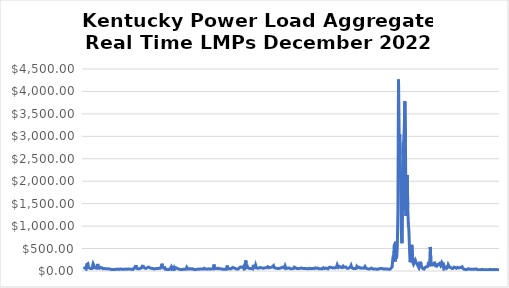
| Category | total_lmp_rt |
|---|---|
| 2022-12-01 05:00:00 | 72.968 |
| 2022-12-01 06:00:00 | 71.115 |
| 2022-12-01 07:00:00 | 66.847 |
| 2022-12-01 08:00:00 | 55.534 |
| 2022-12-01 09:00:00 | 77.757 |
| 2022-12-01 10:00:00 | 53.501 |
| 2022-12-01 11:00:00 | 144.763 |
| 2022-12-01 12:00:00 | 129.385 |
| 2022-12-01 13:00:00 | 161.992 |
| 2022-12-01 14:00:00 | 76.306 |
| 2022-12-01 15:00:00 | 62.544 |
| 2022-12-01 16:00:00 | 62.242 |
| 2022-12-01 17:00:00 | 60.23 |
| 2022-12-01 18:00:00 | 53.278 |
| 2022-12-01 19:00:00 | 52.015 |
| 2022-12-01 20:00:00 | 53.457 |
| 2022-12-01 21:00:00 | 67.545 |
| 2022-12-01 22:00:00 | 161.255 |
| 2022-12-01 23:00:00 | 132.922 |
| 2022-12-02 | 75.383 |
| 2022-12-02 01:00:00 | 80.03 |
| 2022-12-02 02:00:00 | 69.334 |
| 2022-12-02 03:00:00 | 62.77 |
| 2022-12-02 04:00:00 | 62.117 |
| 2022-12-02 05:00:00 | 80.503 |
| 2022-12-02 06:00:00 | 156.75 |
| 2022-12-02 07:00:00 | 77.523 |
| 2022-12-02 08:00:00 | 64.673 |
| 2022-12-02 09:00:00 | 58.983 |
| 2022-12-02 10:00:00 | 53.458 |
| 2022-12-02 11:00:00 | 78.955 |
| 2022-12-02 12:00:00 | 83.455 |
| 2022-12-02 13:00:00 | 72.29 |
| 2022-12-02 14:00:00 | 57.19 |
| 2022-12-02 15:00:00 | 50.995 |
| 2022-12-02 16:00:00 | 50.774 |
| 2022-12-02 17:00:00 | 54.528 |
| 2022-12-02 18:00:00 | 50.775 |
| 2022-12-02 19:00:00 | 52.014 |
| 2022-12-02 20:00:00 | 48.647 |
| 2022-12-02 21:00:00 | 51.531 |
| 2022-12-02 22:00:00 | 51.166 |
| 2022-12-02 23:00:00 | 50.798 |
| 2022-12-03 | 44.968 |
| 2022-12-03 01:00:00 | 46.812 |
| 2022-12-03 02:00:00 | 49.98 |
| 2022-12-03 03:00:00 | 44.397 |
| 2022-12-03 04:00:00 | 40.021 |
| 2022-12-03 05:00:00 | 35.432 |
| 2022-12-03 06:00:00 | 34.47 |
| 2022-12-03 07:00:00 | 33.284 |
| 2022-12-03 08:00:00 | 32.14 |
| 2022-12-03 09:00:00 | 33.902 |
| 2022-12-03 10:00:00 | 34.289 |
| 2022-12-03 11:00:00 | 34.054 |
| 2022-12-03 12:00:00 | 36.284 |
| 2022-12-03 13:00:00 | 38.821 |
| 2022-12-03 14:00:00 | 50.355 |
| 2022-12-03 15:00:00 | 38.915 |
| 2022-12-03 16:00:00 | 37.517 |
| 2022-12-03 17:00:00 | 42.807 |
| 2022-12-03 18:00:00 | 37.312 |
| 2022-12-03 19:00:00 | 35.168 |
| 2022-12-03 20:00:00 | 37.104 |
| 2022-12-03 21:00:00 | 44.084 |
| 2022-12-03 22:00:00 | 50.157 |
| 2022-12-03 23:00:00 | 41.532 |
| 2022-12-04 | 37.338 |
| 2022-12-04 01:00:00 | 39.371 |
| 2022-12-04 02:00:00 | 39.074 |
| 2022-12-04 03:00:00 | 41.411 |
| 2022-12-04 04:00:00 | 37.251 |
| 2022-12-04 05:00:00 | 39.615 |
| 2022-12-04 06:00:00 | 40.901 |
| 2022-12-04 07:00:00 | 44.484 |
| 2022-12-04 08:00:00 | 49.06 |
| 2022-12-04 09:00:00 | 38.561 |
| 2022-12-04 10:00:00 | 44.48 |
| 2022-12-04 11:00:00 | 44.413 |
| 2022-12-04 12:00:00 | 46.541 |
| 2022-12-04 13:00:00 | 41.88 |
| 2022-12-04 14:00:00 | 39.599 |
| 2022-12-04 15:00:00 | 40.661 |
| 2022-12-04 16:00:00 | 39.61 |
| 2022-12-04 17:00:00 | 37.993 |
| 2022-12-04 18:00:00 | 35.511 |
| 2022-12-04 19:00:00 | 35.707 |
| 2022-12-04 20:00:00 | 36.865 |
| 2022-12-04 21:00:00 | 66.652 |
| 2022-12-04 22:00:00 | 83.476 |
| 2022-12-04 23:00:00 | 87.166 |
| 2022-12-05 | 130.054 |
| 2022-12-05 01:00:00 | 60.303 |
| 2022-12-05 02:00:00 | 54.114 |
| 2022-12-05 03:00:00 | 52.074 |
| 2022-12-05 04:00:00 | 45.267 |
| 2022-12-05 05:00:00 | 47.244 |
| 2022-12-05 06:00:00 | 51.552 |
| 2022-12-05 07:00:00 | 55.775 |
| 2022-12-05 08:00:00 | 56.871 |
| 2022-12-05 09:00:00 | 63.464 |
| 2022-12-05 10:00:00 | 79.667 |
| 2022-12-05 11:00:00 | 108.524 |
| 2022-12-05 12:00:00 | 114.294 |
| 2022-12-05 13:00:00 | 102.926 |
| 2022-12-05 14:00:00 | 73.124 |
| 2022-12-05 15:00:00 | 68.339 |
| 2022-12-05 16:00:00 | 62.836 |
| 2022-12-05 17:00:00 | 63.811 |
| 2022-12-05 18:00:00 | 59.455 |
| 2022-12-05 19:00:00 | 59.887 |
| 2022-12-05 20:00:00 | 78.845 |
| 2022-12-05 21:00:00 | 66.143 |
| 2022-12-05 22:00:00 | 86.52 |
| 2022-12-05 23:00:00 | 74.453 |
| 2022-12-06 | 71.548 |
| 2022-12-06 01:00:00 | 71.678 |
| 2022-12-06 02:00:00 | 62.349 |
| 2022-12-06 03:00:00 | 55.345 |
| 2022-12-06 04:00:00 | 53.792 |
| 2022-12-06 05:00:00 | 57.349 |
| 2022-12-06 06:00:00 | 53.973 |
| 2022-12-06 07:00:00 | 48.415 |
| 2022-12-06 08:00:00 | 43.917 |
| 2022-12-06 09:00:00 | 48.074 |
| 2022-12-06 10:00:00 | 52.559 |
| 2022-12-06 11:00:00 | 47.477 |
| 2022-12-06 12:00:00 | 54.911 |
| 2022-12-06 13:00:00 | 51.92 |
| 2022-12-06 14:00:00 | 56.962 |
| 2022-12-06 15:00:00 | 52.118 |
| 2022-12-06 16:00:00 | 59.213 |
| 2022-12-06 17:00:00 | 57.22 |
| 2022-12-06 18:00:00 | 59.532 |
| 2022-12-06 19:00:00 | 47.712 |
| 2022-12-06 20:00:00 | 100.912 |
| 2022-12-06 21:00:00 | 162.377 |
| 2022-12-06 22:00:00 | 94.604 |
| 2022-12-06 23:00:00 | 78.298 |
| 2022-12-07 | 65.498 |
| 2022-12-07 01:00:00 | 58.237 |
| 2022-12-07 02:00:00 | 75.032 |
| 2022-12-07 03:00:00 | 39.588 |
| 2022-12-07 04:00:00 | 31.875 |
| 2022-12-07 05:00:00 | 36.134 |
| 2022-12-07 06:00:00 | 35.708 |
| 2022-12-07 07:00:00 | 32.119 |
| 2022-12-07 08:00:00 | 31.491 |
| 2022-12-07 09:00:00 | 32.957 |
| 2022-12-07 10:00:00 | 39.308 |
| 2022-12-07 11:00:00 | 47.636 |
| 2022-12-07 12:00:00 | 55.557 |
| 2022-12-07 13:00:00 | 90.271 |
| 2022-12-07 14:00:00 | 47.759 |
| 2022-12-07 15:00:00 | 73.52 |
| 2022-12-07 16:00:00 | 57.577 |
| 2022-12-07 17:00:00 | 41.275 |
| 2022-12-07 18:00:00 | 72.631 |
| 2022-12-07 19:00:00 | 41.496 |
| 2022-12-07 20:00:00 | 44.571 |
| 2022-12-07 21:00:00 | 73.17 |
| 2022-12-07 22:00:00 | 90.959 |
| 2022-12-07 23:00:00 | 59.127 |
| 2022-12-08 | 49.324 |
| 2022-12-08 01:00:00 | 49.591 |
| 2022-12-08 02:00:00 | 58.83 |
| 2022-12-08 03:00:00 | 37.605 |
| 2022-12-08 04:00:00 | 31.746 |
| 2022-12-08 05:00:00 | 34.089 |
| 2022-12-08 06:00:00 | 32.861 |
| 2022-12-08 07:00:00 | 30.393 |
| 2022-12-08 08:00:00 | 30.276 |
| 2022-12-08 09:00:00 | 36.063 |
| 2022-12-08 10:00:00 | 55.006 |
| 2022-12-08 11:00:00 | 42.049 |
| 2022-12-08 12:00:00 | 59.973 |
| 2022-12-08 13:00:00 | 36.8 |
| 2022-12-08 14:00:00 | 52.381 |
| 2022-12-08 15:00:00 | 40.66 |
| 2022-12-08 16:00:00 | 82.755 |
| 2022-12-08 17:00:00 | 64.437 |
| 2022-12-08 18:00:00 | 50.74 |
| 2022-12-08 19:00:00 | 52.31 |
| 2022-12-08 20:00:00 | 42.831 |
| 2022-12-08 21:00:00 | 58.557 |
| 2022-12-08 22:00:00 | 53.903 |
| 2022-12-08 23:00:00 | 42.645 |
| 2022-12-09 | 44.646 |
| 2022-12-09 01:00:00 | 44.723 |
| 2022-12-09 02:00:00 | 49.321 |
| 2022-12-09 03:00:00 | 37.536 |
| 2022-12-09 04:00:00 | 34.927 |
| 2022-12-09 05:00:00 | 32.16 |
| 2022-12-09 06:00:00 | 33.27 |
| 2022-12-09 07:00:00 | 33.328 |
| 2022-12-09 08:00:00 | 34.375 |
| 2022-12-09 09:00:00 | 37.818 |
| 2022-12-09 10:00:00 | 36.639 |
| 2022-12-09 11:00:00 | 55.028 |
| 2022-12-09 12:00:00 | 46.267 |
| 2022-12-09 13:00:00 | 37.213 |
| 2022-12-09 14:00:00 | 40.32 |
| 2022-12-09 15:00:00 | 42.922 |
| 2022-12-09 16:00:00 | 43.792 |
| 2022-12-09 17:00:00 | 45.854 |
| 2022-12-09 18:00:00 | 45.982 |
| 2022-12-09 19:00:00 | 47.952 |
| 2022-12-09 20:00:00 | 41.847 |
| 2022-12-09 21:00:00 | 50.755 |
| 2022-12-09 22:00:00 | 60.679 |
| 2022-12-09 23:00:00 | 47.279 |
| 2022-12-10 | 45.025 |
| 2022-12-10 01:00:00 | 45.543 |
| 2022-12-10 02:00:00 | 45.951 |
| 2022-12-10 03:00:00 | 43.673 |
| 2022-12-10 04:00:00 | 40.79 |
| 2022-12-10 05:00:00 | 48.121 |
| 2022-12-10 06:00:00 | 49.057 |
| 2022-12-10 07:00:00 | 46.953 |
| 2022-12-10 08:00:00 | 43.664 |
| 2022-12-10 09:00:00 | 49.439 |
| 2022-12-10 10:00:00 | 44.179 |
| 2022-12-10 11:00:00 | 43.996 |
| 2022-12-10 12:00:00 | 48.755 |
| 2022-12-10 13:00:00 | 50.001 |
| 2022-12-10 14:00:00 | 63.6 |
| 2022-12-10 15:00:00 | 144.541 |
| 2022-12-10 16:00:00 | 50.954 |
| 2022-12-10 17:00:00 | 56.826 |
| 2022-12-10 18:00:00 | 59.881 |
| 2022-12-10 19:00:00 | 54.579 |
| 2022-12-10 20:00:00 | 52.352 |
| 2022-12-10 21:00:00 | 49.735 |
| 2022-12-10 22:00:00 | 62.311 |
| 2022-12-10 23:00:00 | 51.551 |
| 2022-12-11 | 48.047 |
| 2022-12-11 01:00:00 | 47.417 |
| 2022-12-11 02:00:00 | 51.161 |
| 2022-12-11 03:00:00 | 45.91 |
| 2022-12-11 04:00:00 | 42.925 |
| 2022-12-11 05:00:00 | 40.588 |
| 2022-12-11 06:00:00 | 41.398 |
| 2022-12-11 07:00:00 | 41.706 |
| 2022-12-11 08:00:00 | 41.117 |
| 2022-12-11 09:00:00 | 39.103 |
| 2022-12-11 10:00:00 | 38.779 |
| 2022-12-11 11:00:00 | 37.521 |
| 2022-12-11 12:00:00 | 37.752 |
| 2022-12-11 13:00:00 | 44.182 |
| 2022-12-11 14:00:00 | 121.578 |
| 2022-12-11 15:00:00 | 49.496 |
| 2022-12-11 16:00:00 | 51.548 |
| 2022-12-11 17:00:00 | 48.05 |
| 2022-12-11 18:00:00 | 48.759 |
| 2022-12-11 19:00:00 | 48.409 |
| 2022-12-11 20:00:00 | 52.229 |
| 2022-12-11 21:00:00 | 51.83 |
| 2022-12-11 22:00:00 | 69.457 |
| 2022-12-11 23:00:00 | 78.924 |
| 2022-12-12 | 75.476 |
| 2022-12-12 01:00:00 | 70.08 |
| 2022-12-12 02:00:00 | 63.348 |
| 2022-12-12 03:00:00 | 63.431 |
| 2022-12-12 04:00:00 | 49.876 |
| 2022-12-12 05:00:00 | 47.073 |
| 2022-12-12 06:00:00 | 53.329 |
| 2022-12-12 07:00:00 | 46.144 |
| 2022-12-12 08:00:00 | 51.742 |
| 2022-12-12 09:00:00 | 43.843 |
| 2022-12-12 10:00:00 | 42.388 |
| 2022-12-12 11:00:00 | 71.727 |
| 2022-12-12 12:00:00 | 75.454 |
| 2022-12-12 13:00:00 | 90.278 |
| 2022-12-12 14:00:00 | 69.73 |
| 2022-12-12 15:00:00 | 85.471 |
| 2022-12-12 16:00:00 | 91.666 |
| 2022-12-12 17:00:00 | 68.919 |
| 2022-12-12 18:00:00 | 93.761 |
| 2022-12-12 19:00:00 | 60.262 |
| 2022-12-12 20:00:00 | 70.312 |
| 2022-12-12 21:00:00 | 113.593 |
| 2022-12-12 22:00:00 | 235.297 |
| 2022-12-12 23:00:00 | 77.65 |
| 2022-12-13 | 76.804 |
| 2022-12-13 01:00:00 | 97.544 |
| 2022-12-13 02:00:00 | 70.09 |
| 2022-12-13 03:00:00 | 61.727 |
| 2022-12-13 04:00:00 | 57.633 |
| 2022-12-13 05:00:00 | 64.35 |
| 2022-12-13 06:00:00 | 57.744 |
| 2022-12-13 07:00:00 | 56.149 |
| 2022-12-13 08:00:00 | 56.584 |
| 2022-12-13 09:00:00 | 66.112 |
| 2022-12-13 10:00:00 | 46.731 |
| 2022-12-13 11:00:00 | 137.069 |
| 2022-12-13 12:00:00 | 92.694 |
| 2022-12-13 13:00:00 | 82.823 |
| 2022-12-13 14:00:00 | 79.651 |
| 2022-12-13 15:00:00 | 129.777 |
| 2022-12-13 16:00:00 | 86.482 |
| 2022-12-13 17:00:00 | 70.063 |
| 2022-12-13 18:00:00 | 61.56 |
| 2022-12-13 19:00:00 | 60.582 |
| 2022-12-13 20:00:00 | 63.72 |
| 2022-12-13 21:00:00 | 71.802 |
| 2022-12-13 22:00:00 | 76.757 |
| 2022-12-13 23:00:00 | 64.004 |
| 2022-12-14 | 73.832 |
| 2022-12-14 01:00:00 | 82.886 |
| 2022-12-14 02:00:00 | 67.731 |
| 2022-12-14 03:00:00 | 72.867 |
| 2022-12-14 04:00:00 | 62.858 |
| 2022-12-14 05:00:00 | 70.461 |
| 2022-12-14 06:00:00 | 66.448 |
| 2022-12-14 07:00:00 | 67.181 |
| 2022-12-14 08:00:00 | 72.316 |
| 2022-12-14 09:00:00 | 86.778 |
| 2022-12-14 10:00:00 | 71.28 |
| 2022-12-14 11:00:00 | 85.738 |
| 2022-12-14 12:00:00 | 95.735 |
| 2022-12-14 13:00:00 | 92.798 |
| 2022-12-14 14:00:00 | 70.958 |
| 2022-12-14 15:00:00 | 83.586 |
| 2022-12-14 16:00:00 | 80.132 |
| 2022-12-14 17:00:00 | 70.732 |
| 2022-12-14 18:00:00 | 82.057 |
| 2022-12-14 19:00:00 | 75.014 |
| 2022-12-14 20:00:00 | 91.328 |
| 2022-12-14 21:00:00 | 101.219 |
| 2022-12-14 22:00:00 | 117.3 |
| 2022-12-14 23:00:00 | 77.077 |
| 2022-12-15 | 68.703 |
| 2022-12-15 01:00:00 | 65.832 |
| 2022-12-15 02:00:00 | 68.81 |
| 2022-12-15 03:00:00 | 62.189 |
| 2022-12-15 04:00:00 | 50.629 |
| 2022-12-15 05:00:00 | 54.748 |
| 2022-12-15 06:00:00 | 57.841 |
| 2022-12-15 07:00:00 | 55.245 |
| 2022-12-15 08:00:00 | 49.574 |
| 2022-12-15 09:00:00 | 63.38 |
| 2022-12-15 10:00:00 | 64.65 |
| 2022-12-15 11:00:00 | 67.946 |
| 2022-12-15 12:00:00 | 73.381 |
| 2022-12-15 13:00:00 | 81.842 |
| 2022-12-15 14:00:00 | 101.669 |
| 2022-12-15 15:00:00 | 87.257 |
| 2022-12-15 16:00:00 | 79.859 |
| 2022-12-15 17:00:00 | 65.725 |
| 2022-12-15 18:00:00 | 109.6 |
| 2022-12-15 19:00:00 | 74.622 |
| 2022-12-15 20:00:00 | 60.881 |
| 2022-12-15 21:00:00 | 56.974 |
| 2022-12-15 22:00:00 | 64.788 |
| 2022-12-15 23:00:00 | 65.233 |
| 2022-12-16 | 59.284 |
| 2022-12-16 01:00:00 | 65.544 |
| 2022-12-16 02:00:00 | 52.816 |
| 2022-12-16 03:00:00 | 51.234 |
| 2022-12-16 04:00:00 | 47.476 |
| 2022-12-16 05:00:00 | 48.812 |
| 2022-12-16 06:00:00 | 48.36 |
| 2022-12-16 07:00:00 | 53.07 |
| 2022-12-16 08:00:00 | 53.759 |
| 2022-12-16 09:00:00 | 59.476 |
| 2022-12-16 10:00:00 | 85.007 |
| 2022-12-16 11:00:00 | 89.847 |
| 2022-12-16 12:00:00 | 70.138 |
| 2022-12-16 13:00:00 | 61.566 |
| 2022-12-16 14:00:00 | 55.995 |
| 2022-12-16 15:00:00 | 63.07 |
| 2022-12-16 16:00:00 | 57.138 |
| 2022-12-16 17:00:00 | 60.305 |
| 2022-12-16 18:00:00 | 57.712 |
| 2022-12-16 19:00:00 | 55.544 |
| 2022-12-16 20:00:00 | 59.36 |
| 2022-12-16 21:00:00 | 59.744 |
| 2022-12-16 22:00:00 | 66.175 |
| 2022-12-16 23:00:00 | 59.359 |
| 2022-12-17 | 60.421 |
| 2022-12-17 01:00:00 | 58.536 |
| 2022-12-17 02:00:00 | 54.794 |
| 2022-12-17 03:00:00 | 55.507 |
| 2022-12-17 04:00:00 | 54.568 |
| 2022-12-17 05:00:00 | 61.172 |
| 2022-12-17 06:00:00 | 54.858 |
| 2022-12-17 07:00:00 | 54.217 |
| 2022-12-17 08:00:00 | 51.727 |
| 2022-12-17 09:00:00 | 47.135 |
| 2022-12-17 10:00:00 | 49.78 |
| 2022-12-17 11:00:00 | 52.257 |
| 2022-12-17 12:00:00 | 61.246 |
| 2022-12-17 13:00:00 | 56.842 |
| 2022-12-17 14:00:00 | 50.566 |
| 2022-12-17 15:00:00 | 57.411 |
| 2022-12-17 16:00:00 | 56.1 |
| 2022-12-17 17:00:00 | 54.979 |
| 2022-12-17 18:00:00 | 55.274 |
| 2022-12-17 19:00:00 | 51.435 |
| 2022-12-17 20:00:00 | 53.05 |
| 2022-12-17 21:00:00 | 73.008 |
| 2022-12-17 22:00:00 | 70.079 |
| 2022-12-17 23:00:00 | 64.829 |
| 2022-12-18 | 59.652 |
| 2022-12-18 01:00:00 | 61.438 |
| 2022-12-18 02:00:00 | 66.503 |
| 2022-12-18 03:00:00 | 58.086 |
| 2022-12-18 04:00:00 | 50.753 |
| 2022-12-18 05:00:00 | 50.246 |
| 2022-12-18 06:00:00 | 52.248 |
| 2022-12-18 07:00:00 | 50.918 |
| 2022-12-18 08:00:00 | 49.723 |
| 2022-12-18 09:00:00 | 45.851 |
| 2022-12-18 10:00:00 | 47.689 |
| 2022-12-18 11:00:00 | 51.117 |
| 2022-12-18 12:00:00 | 71.29 |
| 2022-12-18 13:00:00 | 58.434 |
| 2022-12-18 14:00:00 | 54.117 |
| 2022-12-18 15:00:00 | 56.496 |
| 2022-12-18 16:00:00 | 64.475 |
| 2022-12-18 17:00:00 | 65.529 |
| 2022-12-18 18:00:00 | 58.979 |
| 2022-12-18 19:00:00 | 53.204 |
| 2022-12-18 20:00:00 | 47.577 |
| 2022-12-18 21:00:00 | 67.778 |
| 2022-12-18 22:00:00 | 80.814 |
| 2022-12-18 23:00:00 | 84.907 |
| 2022-12-19 | 83.263 |
| 2022-12-19 01:00:00 | 72.017 |
| 2022-12-19 02:00:00 | 78.339 |
| 2022-12-19 03:00:00 | 81.063 |
| 2022-12-19 04:00:00 | 68.027 |
| 2022-12-19 05:00:00 | 74.238 |
| 2022-12-19 06:00:00 | 71.528 |
| 2022-12-19 07:00:00 | 70.668 |
| 2022-12-19 08:00:00 | 67.369 |
| 2022-12-19 09:00:00 | 69.346 |
| 2022-12-19 10:00:00 | 74.533 |
| 2022-12-19 11:00:00 | 102.666 |
| 2022-12-19 12:00:00 | 137.793 |
| 2022-12-19 13:00:00 | 103.49 |
| 2022-12-19 14:00:00 | 78.605 |
| 2022-12-19 15:00:00 | 96.014 |
| 2022-12-19 16:00:00 | 101.462 |
| 2022-12-19 17:00:00 | 93.716 |
| 2022-12-19 18:00:00 | 86.505 |
| 2022-12-19 19:00:00 | 97.055 |
| 2022-12-19 20:00:00 | 74.005 |
| 2022-12-19 21:00:00 | 77.433 |
| 2022-12-19 22:00:00 | 105.176 |
| 2022-12-19 23:00:00 | 82.292 |
| 2022-12-20 | 91.764 |
| 2022-12-20 01:00:00 | 89.137 |
| 2022-12-20 02:00:00 | 86.546 |
| 2022-12-20 03:00:00 | 88.244 |
| 2022-12-20 04:00:00 | 67.35 |
| 2022-12-20 05:00:00 | 61.699 |
| 2022-12-20 06:00:00 | 41.666 |
| 2022-12-20 07:00:00 | 59.888 |
| 2022-12-20 08:00:00 | 55.921 |
| 2022-12-20 09:00:00 | 71.334 |
| 2022-12-20 10:00:00 | 71.004 |
| 2022-12-20 11:00:00 | 93.88 |
| 2022-12-20 12:00:00 | 123.066 |
| 2022-12-20 13:00:00 | 81.582 |
| 2022-12-20 14:00:00 | 70.512 |
| 2022-12-20 15:00:00 | 60.448 |
| 2022-12-20 16:00:00 | 60.424 |
| 2022-12-20 17:00:00 | 54.898 |
| 2022-12-20 18:00:00 | 54.055 |
| 2022-12-20 19:00:00 | 54.827 |
| 2022-12-20 20:00:00 | 52.642 |
| 2022-12-20 21:00:00 | 59.242 |
| 2022-12-20 22:00:00 | 103.884 |
| 2022-12-20 23:00:00 | 86.508 |
| 2022-12-21 | 75.947 |
| 2022-12-21 01:00:00 | 75.388 |
| 2022-12-21 02:00:00 | 83.393 |
| 2022-12-21 03:00:00 | 67.038 |
| 2022-12-21 04:00:00 | 63.429 |
| 2022-12-21 05:00:00 | 62.39 |
| 2022-12-21 06:00:00 | 69.543 |
| 2022-12-21 07:00:00 | 66.227 |
| 2022-12-21 08:00:00 | 64.233 |
| 2022-12-21 09:00:00 | 63.368 |
| 2022-12-21 10:00:00 | 62.069 |
| 2022-12-21 11:00:00 | 74.433 |
| 2022-12-21 12:00:00 | 100.562 |
| 2022-12-21 13:00:00 | 74.133 |
| 2022-12-21 14:00:00 | 63.418 |
| 2022-12-21 15:00:00 | 53.38 |
| 2022-12-21 16:00:00 | 49.386 |
| 2022-12-21 17:00:00 | 47.818 |
| 2022-12-21 18:00:00 | 49.751 |
| 2022-12-21 19:00:00 | 45.171 |
| 2022-12-21 20:00:00 | 47.197 |
| 2022-12-21 21:00:00 | 48.42 |
| 2022-12-21 22:00:00 | 63.522 |
| 2022-12-21 23:00:00 | 64.894 |
| 2022-12-22 | 50.953 |
| 2022-12-22 01:00:00 | 50.351 |
| 2022-12-22 02:00:00 | 48.089 |
| 2022-12-22 03:00:00 | 43.451 |
| 2022-12-22 04:00:00 | 37.54 |
| 2022-12-22 05:00:00 | 44.12 |
| 2022-12-22 06:00:00 | 43.045 |
| 2022-12-22 07:00:00 | 44.331 |
| 2022-12-22 08:00:00 | 39.977 |
| 2022-12-22 09:00:00 | 37.428 |
| 2022-12-22 10:00:00 | 41.345 |
| 2022-12-22 11:00:00 | 45.701 |
| 2022-12-22 12:00:00 | 50.487 |
| 2022-12-22 13:00:00 | 49.289 |
| 2022-12-22 14:00:00 | 51.85 |
| 2022-12-22 15:00:00 | 56.537 |
| 2022-12-22 16:00:00 | 50.68 |
| 2022-12-22 17:00:00 | 56.492 |
| 2022-12-22 18:00:00 | 53.862 |
| 2022-12-22 19:00:00 | 49.304 |
| 2022-12-22 20:00:00 | 43.125 |
| 2022-12-22 21:00:00 | 42.56 |
| 2022-12-22 22:00:00 | 48.614 |
| 2022-12-22 23:00:00 | 48.187 |
| 2022-12-23 | 47.779 |
| 2022-12-23 01:00:00 | 42.792 |
| 2022-12-23 02:00:00 | 45.784 |
| 2022-12-23 03:00:00 | 44.714 |
| 2022-12-23 04:00:00 | 38.266 |
| 2022-12-23 05:00:00 | 37.307 |
| 2022-12-23 06:00:00 | 39.526 |
| 2022-12-23 07:00:00 | 38.233 |
| 2022-12-23 08:00:00 | 43.706 |
| 2022-12-23 09:00:00 | 60.863 |
| 2022-12-23 10:00:00 | 69.657 |
| 2022-12-23 11:00:00 | 93.651 |
| 2022-12-23 12:00:00 | 252.823 |
| 2022-12-23 13:00:00 | 346.921 |
| 2022-12-23 14:00:00 | 314.237 |
| 2022-12-23 15:00:00 | 605.268 |
| 2022-12-23 16:00:00 | 212.491 |
| 2022-12-23 17:00:00 | 650.564 |
| 2022-12-23 18:00:00 | 280.197 |
| 2022-12-23 19:00:00 | 323.987 |
| 2022-12-23 20:00:00 | 572.138 |
| 2022-12-23 21:00:00 | 1324.56 |
| 2022-12-23 22:00:00 | 4265.802 |
| 2022-12-23 23:00:00 | 2474.005 |
| 2022-12-24 | 3039.259 |
| 2022-12-24 01:00:00 | 2586.47 |
| 2022-12-24 02:00:00 | 2604.561 |
| 2022-12-24 03:00:00 | 854.086 |
| 2022-12-24 04:00:00 | 620.121 |
| 2022-12-24 05:00:00 | 2039.211 |
| 2022-12-24 06:00:00 | 1337.953 |
| 2022-12-24 07:00:00 | 2866.915 |
| 2022-12-24 08:00:00 | 3200.034 |
| 2022-12-24 09:00:00 | 3779.413 |
| 2022-12-24 10:00:00 | 2882.638 |
| 2022-12-24 11:00:00 | 1224.107 |
| 2022-12-24 12:00:00 | 1872.913 |
| 2022-12-24 13:00:00 | 2139.758 |
| 2022-12-24 14:00:00 | 1412.839 |
| 2022-12-24 15:00:00 | 1047.348 |
| 2022-12-24 16:00:00 | 897.064 |
| 2022-12-24 17:00:00 | 507.323 |
| 2022-12-24 18:00:00 | 195.63 |
| 2022-12-24 19:00:00 | 176.441 |
| 2022-12-24 20:00:00 | 283.772 |
| 2022-12-24 21:00:00 | 582.843 |
| 2022-12-24 22:00:00 | 388.482 |
| 2022-12-24 23:00:00 | 183.647 |
| 2022-12-25 | 153.412 |
| 2022-12-25 01:00:00 | 150.373 |
| 2022-12-25 02:00:00 | 220.613 |
| 2022-12-25 03:00:00 | 243.798 |
| 2022-12-25 04:00:00 | 202.699 |
| 2022-12-25 05:00:00 | 200.376 |
| 2022-12-25 06:00:00 | 155.026 |
| 2022-12-25 07:00:00 | 130.641 |
| 2022-12-25 08:00:00 | 104.236 |
| 2022-12-25 09:00:00 | 135.983 |
| 2022-12-25 10:00:00 | 85.854 |
| 2022-12-25 11:00:00 | 126.258 |
| 2022-12-25 12:00:00 | 204.126 |
| 2022-12-25 13:00:00 | 146.166 |
| 2022-12-25 14:00:00 | 99.629 |
| 2022-12-25 15:00:00 | 76.634 |
| 2022-12-25 16:00:00 | 54.307 |
| 2022-12-25 17:00:00 | 58.33 |
| 2022-12-25 18:00:00 | 42.387 |
| 2022-12-25 19:00:00 | 42.262 |
| 2022-12-25 20:00:00 | 77.809 |
| 2022-12-25 21:00:00 | 99.921 |
| 2022-12-25 22:00:00 | 95.775 |
| 2022-12-25 23:00:00 | 76.441 |
| 2022-12-26 | 94.307 |
| 2022-12-26 01:00:00 | 122.236 |
| 2022-12-26 02:00:00 | 203.765 |
| 2022-12-26 03:00:00 | 108.133 |
| 2022-12-26 04:00:00 | 169.789 |
| 2022-12-26 05:00:00 | 536.73 |
| 2022-12-26 06:00:00 | 188.264 |
| 2022-12-26 07:00:00 | 132.892 |
| 2022-12-26 08:00:00 | 150.615 |
| 2022-12-26 09:00:00 | 134.993 |
| 2022-12-26 10:00:00 | 130.014 |
| 2022-12-26 11:00:00 | 146.915 |
| 2022-12-26 12:00:00 | 204.905 |
| 2022-12-26 13:00:00 | 155.487 |
| 2022-12-26 14:00:00 | 122.369 |
| 2022-12-26 15:00:00 | 87.418 |
| 2022-12-26 16:00:00 | 162.73 |
| 2022-12-26 17:00:00 | 122.193 |
| 2022-12-26 18:00:00 | 141.924 |
| 2022-12-26 19:00:00 | 147.634 |
| 2022-12-26 20:00:00 | 143.852 |
| 2022-12-26 21:00:00 | 168.887 |
| 2022-12-26 22:00:00 | 139.554 |
| 2022-12-26 23:00:00 | 115.397 |
| 2022-12-27 | 138.862 |
| 2022-12-27 01:00:00 | 184.78 |
| 2022-12-27 02:00:00 | 159.227 |
| 2022-12-27 03:00:00 | 152.983 |
| 2022-12-27 04:00:00 | 65.634 |
| 2022-12-27 05:00:00 | 110.243 |
| 2022-12-27 06:00:00 | 74.409 |
| 2022-12-27 07:00:00 | 74.961 |
| 2022-12-27 08:00:00 | 83.233 |
| 2022-12-27 09:00:00 | 58.032 |
| 2022-12-27 10:00:00 | 70.414 |
| 2022-12-27 11:00:00 | 79.952 |
| 2022-12-27 12:00:00 | 136.931 |
| 2022-12-27 13:00:00 | 111.606 |
| 2022-12-27 14:00:00 | 86.724 |
| 2022-12-27 15:00:00 | 73.358 |
| 2022-12-27 16:00:00 | 80.309 |
| 2022-12-27 17:00:00 | 65.831 |
| 2022-12-27 18:00:00 | 60.895 |
| 2022-12-27 19:00:00 | 65.228 |
| 2022-12-27 20:00:00 | 56.928 |
| 2022-12-27 21:00:00 | 77.662 |
| 2022-12-27 22:00:00 | 85.881 |
| 2022-12-27 23:00:00 | 75.459 |
| 2022-12-28 | 79.013 |
| 2022-12-28 01:00:00 | 69.564 |
| 2022-12-28 02:00:00 | 61.366 |
| 2022-12-28 03:00:00 | 76.13 |
| 2022-12-28 04:00:00 | 80.142 |
| 2022-12-28 05:00:00 | 93.497 |
| 2022-12-28 06:00:00 | 68.43 |
| 2022-12-28 07:00:00 | 77.865 |
| 2022-12-28 08:00:00 | 76.266 |
| 2022-12-28 09:00:00 | 87.996 |
| 2022-12-28 10:00:00 | 77.713 |
| 2022-12-28 11:00:00 | 77.922 |
| 2022-12-28 12:00:00 | 93.165 |
| 2022-12-28 13:00:00 | 61.93 |
| 2022-12-28 14:00:00 | 56.643 |
| 2022-12-28 15:00:00 | 42.882 |
| 2022-12-28 16:00:00 | 36.123 |
| 2022-12-28 17:00:00 | 36.488 |
| 2022-12-28 18:00:00 | 40.476 |
| 2022-12-28 19:00:00 | 26.399 |
| 2022-12-28 20:00:00 | 36.964 |
| 2022-12-28 21:00:00 | 38.325 |
| 2022-12-28 22:00:00 | 47.743 |
| 2022-12-28 23:00:00 | 50.943 |
| 2022-12-29 | 44.355 |
| 2022-12-29 01:00:00 | 41.483 |
| 2022-12-29 02:00:00 | 41.358 |
| 2022-12-29 03:00:00 | 41.605 |
| 2022-12-29 04:00:00 | 38.415 |
| 2022-12-29 05:00:00 | 41.724 |
| 2022-12-29 06:00:00 | 38.623 |
| 2022-12-29 07:00:00 | 37.101 |
| 2022-12-29 08:00:00 | 35.131 |
| 2022-12-29 09:00:00 | 38.712 |
| 2022-12-29 10:00:00 | 43.301 |
| 2022-12-29 11:00:00 | 45.993 |
| 2022-12-29 12:00:00 | 50.344 |
| 2022-12-29 13:00:00 | 44.035 |
| 2022-12-29 14:00:00 | 37.021 |
| 2022-12-29 15:00:00 | 28.311 |
| 2022-12-29 16:00:00 | 32.935 |
| 2022-12-29 17:00:00 | 28.606 |
| 2022-12-29 18:00:00 | 27.554 |
| 2022-12-29 19:00:00 | 27.693 |
| 2022-12-29 20:00:00 | 30.844 |
| 2022-12-29 21:00:00 | 31.241 |
| 2022-12-29 22:00:00 | 37.376 |
| 2022-12-29 23:00:00 | 33.909 |
| 2022-12-30 | 32.784 |
| 2022-12-30 01:00:00 | 29.914 |
| 2022-12-30 02:00:00 | 27.793 |
| 2022-12-30 03:00:00 | 27.518 |
| 2022-12-30 04:00:00 | 26.728 |
| 2022-12-30 05:00:00 | 27.828 |
| 2022-12-30 06:00:00 | 26.385 |
| 2022-12-30 07:00:00 | 25.738 |
| 2022-12-30 08:00:00 | 26.311 |
| 2022-12-30 09:00:00 | 26.819 |
| 2022-12-30 10:00:00 | 28.145 |
| 2022-12-30 11:00:00 | 33.047 |
| 2022-12-30 12:00:00 | 35.327 |
| 2022-12-30 13:00:00 | 33.355 |
| 2022-12-30 14:00:00 | 31.5 |
| 2022-12-30 15:00:00 | 31.283 |
| 2022-12-30 16:00:00 | 25.015 |
| 2022-12-30 17:00:00 | 27.676 |
| 2022-12-30 18:00:00 | 25.91 |
| 2022-12-30 19:00:00 | 33.671 |
| 2022-12-30 20:00:00 | 31.511 |
| 2022-12-30 21:00:00 | 27.75 |
| 2022-12-30 22:00:00 | 30.991 |
| 2022-12-30 23:00:00 | 33.262 |
| 2022-12-31 | 30.144 |
| 2022-12-31 01:00:00 | 28.573 |
| 2022-12-31 02:00:00 | 26.464 |
| 2022-12-31 03:00:00 | 27.166 |
| 2022-12-31 04:00:00 | 35.602 |
| 2022-12-31 05:00:00 | 26.6 |